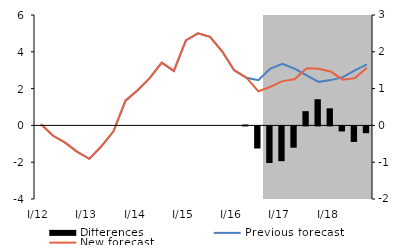
| Category | Differences |
|---|---|
| I/12 | 0 |
| II | 0 |
| III | 0 |
| IV | 0 |
| I/13 | 0 |
| II | 0 |
| III | 0 |
| IV | 0 |
| I/14 | 0 |
| II | 0 |
| III | 0 |
| IV | 0 |
| I/15 | 0 |
| II | 0 |
| III | 0 |
| IV | 0 |
| I/16 | 0 |
| II | 0.023 |
| III | -0.6 |
| IV | -0.995 |
| I/17 | -0.945 |
| II | -0.578 |
| III | 0.387 |
| IV | 0.711 |
| I/18 | 0.464 |
| II | -0.137 |
| III | -0.422 |
| IV | -0.184 |